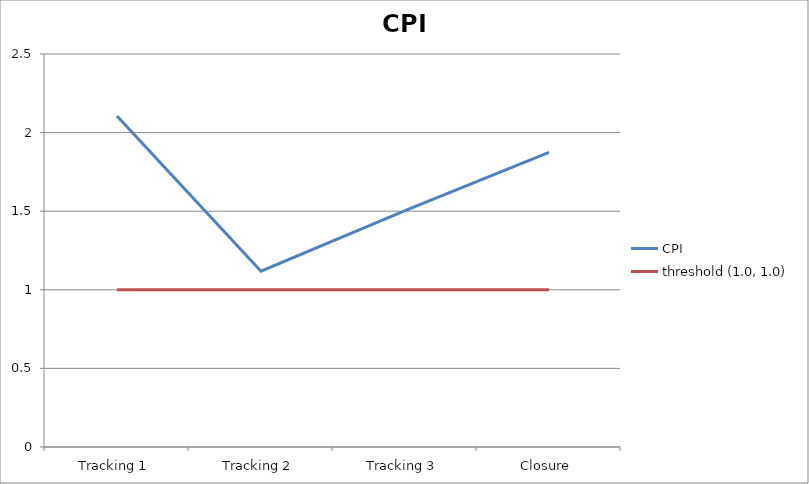
| Category | CPI | threshold (1.0, 1.0) |
|---|---|---|
| Tracking 1 | 2.105 | 1 |
| Tracking 2 | 1.118 | 1 |
| Tracking 3 | 1.504 | 1 |
| Closure | 1.874 | 1 |